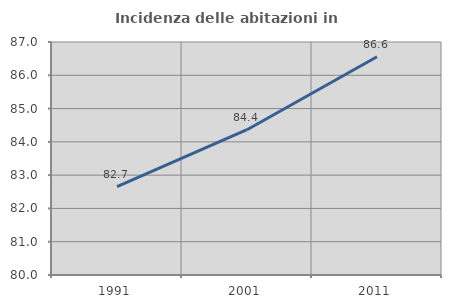
| Category | Incidenza delle abitazioni in proprietà  |
|---|---|
| 1991.0 | 82.657 |
| 2001.0 | 84.365 |
| 2011.0 | 86.557 |